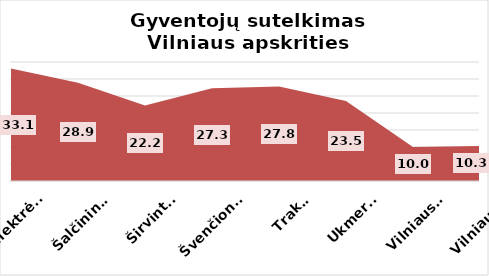
| Category | Series 0 |
|---|---|
| Elektrėnai | 33.1 |
| Šalčininkai | 28.9 |
| Širvintos | 22.2 |
| Švenčionys | 27.3 |
| Trakai | 27.8 |
| Ukmergė | 23.5 |
| Vilniaus r. | 10 |
| Vilniaus m. | 10.3 |